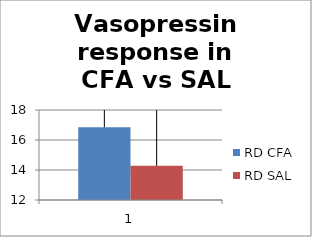
| Category | RD CFA | RD SAL |
|---|---|---|
| 0 | 16.85 | 14.278 |